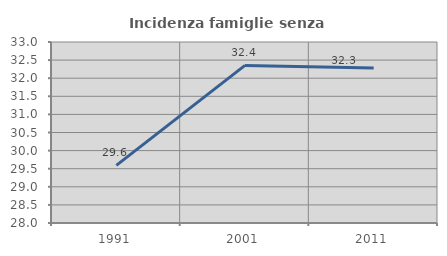
| Category | Incidenza famiglie senza nuclei |
|---|---|
| 1991.0 | 29.592 |
| 2001.0 | 32.353 |
| 2011.0 | 32.282 |